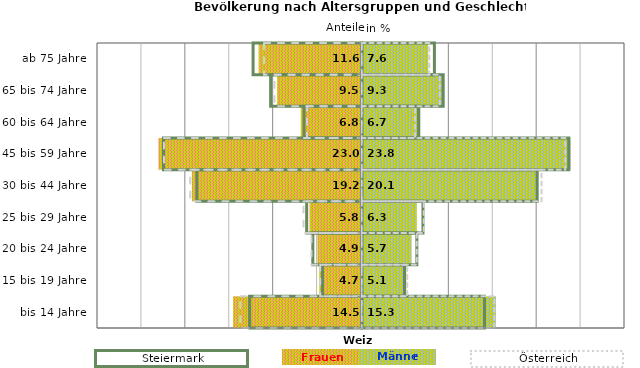
| Category | Frauen | Männer | Frauen Spalte2 | Männer Spalte2 | Frauen Spalte3 | Männer Spalte3 |
|---|---|---|---|---|---|---|
| bis 14 Jahre | -14.5 | 15.3 | 14 | -12.8 | -13.8 | 15.1 |
| 15 bis 19 Jahre | -4.7 | 5.1 | 4.9 | -4.5 | -4.7 | 5.2 |
| 20 bis 24 Jahre | -4.9 | 5.7 | 6.3 | -5.6 | -5.7 | 6.3 |
| 25 bis 29 Jahre | -5.8 | 6.3 | 7 | -6.3 | -6.6 | 7.1 |
| 30 bis 44 Jahre | -19.2 | 20.1 | 20 | -18.8 | -19.5 | 20.5 |
| 45 bis 59 Jahre | -23 | 23.8 | 23.6 | -22.6 | -22.5 | 23.2 |
| 60 bis 64 Jahre | -6.8 | 6.7 | 6.5 | -6.6 | -6.2 | 6.1 |
| 65 bis 74 Jahre | -9.5 | 9.3 | 9.3 | -10.4 | -9.9 | 8.9 |
| ab 75 Jahre | -11.6 | 7.6 | 8.3 | -12.4 | -11.1 | 7.7 |